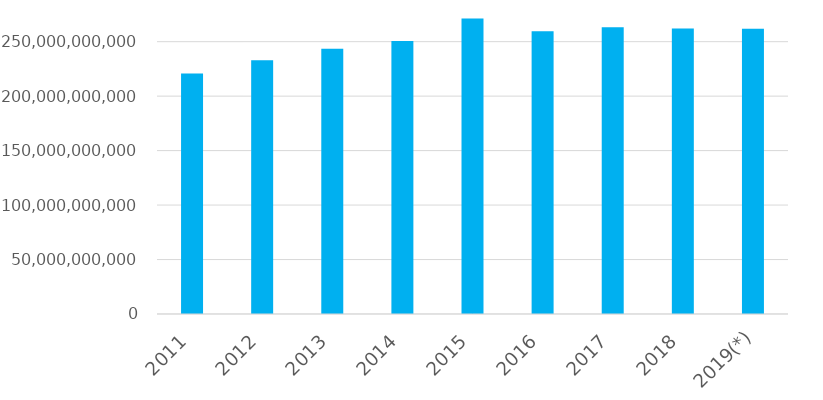
| Category | Totale complessivo |
|---|---|
| 2011 | 220795252010.11 |
| 2012 | 232963931821.46 |
| 2013 | 243493252329.23 |
| 2014 | 250612035208.83 |
| 2015 | 271212685636.7 |
| 2016 | 259495493522.17 |
| 2017 | 263215443263.94 |
| 2018 | 262182135673 |
| 2019(*) | 261762406319 |